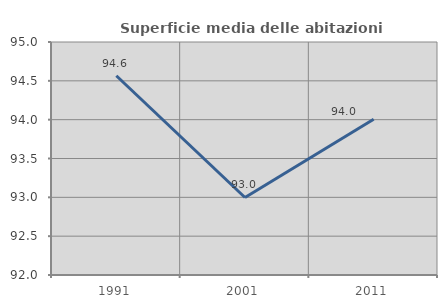
| Category | Superficie media delle abitazioni occupate |
|---|---|
| 1991.0 | 94.565 |
| 2001.0 | 92.998 |
| 2011.0 | 94.005 |